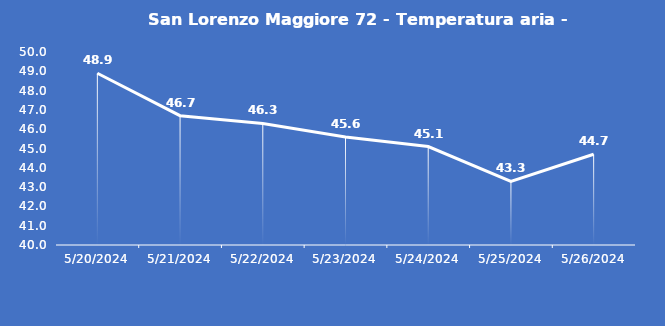
| Category | San Lorenzo Maggiore 72 - Temperatura aria - Grezzo (°C) |
|---|---|
| 5/20/24 | 48.9 |
| 5/21/24 | 46.7 |
| 5/22/24 | 46.3 |
| 5/23/24 | 45.6 |
| 5/24/24 | 45.1 |
| 5/25/24 | 43.3 |
| 5/26/24 | 44.7 |